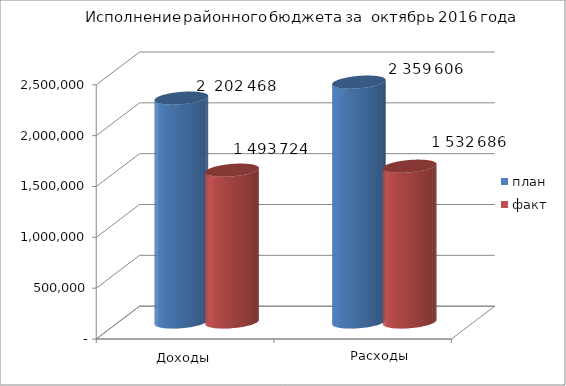
| Category | план | факт |
|---|---|---|
| 0 | 2202468 | 1493724 |
| 1 | 2359606 | 1532686 |